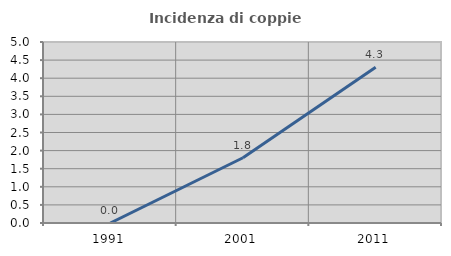
| Category | Incidenza di coppie miste |
|---|---|
| 1991.0 | 0 |
| 2001.0 | 1.802 |
| 2011.0 | 4.301 |